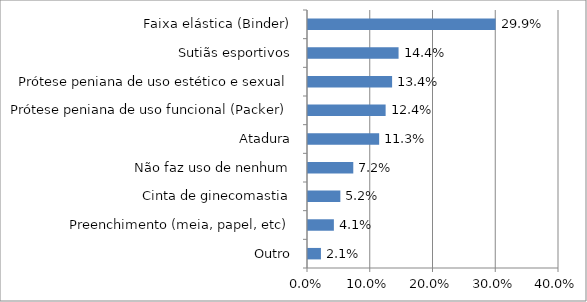
| Category | Series 0 |
|---|---|
| Outro | 0.021 |
| Preenchimento (meia, papel, etc) | 0.041 |
| Cinta de ginecomastia | 0.052 |
| Não faz uso de nenhum | 0.072 |
| Atadura | 0.113 |
| Prótese peniana de uso funcional (Packer) | 0.124 |
| Prótese peniana de uso estético e sexual | 0.134 |
| Sutiãs esportivos | 0.144 |
| Faixa elástica (Binder) | 0.299 |